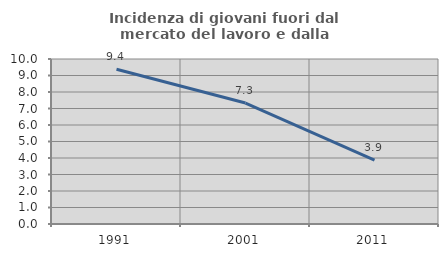
| Category | Incidenza di giovani fuori dal mercato del lavoro e dalla formazione  |
|---|---|
| 1991.0 | 9.375 |
| 2001.0 | 7.33 |
| 2011.0 | 3.867 |